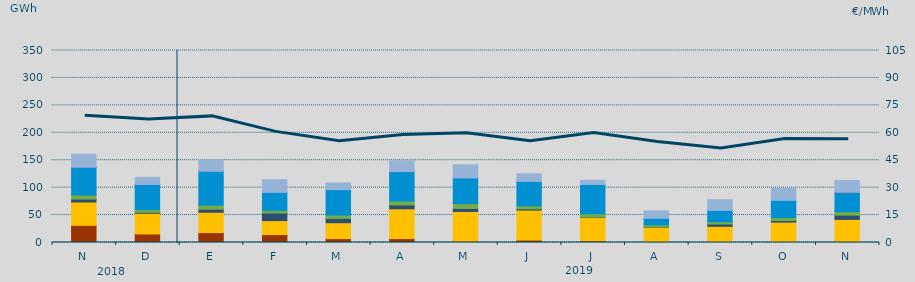
| Category | Carbón | Ciclo Combinado | Cogeneración | Consumo Bombeo | Eólica | Hidráulica | Nuclear | Otras Renovables | Solar fotovoltaica | Turbinación bombeo |
|---|---|---|---|---|---|---|---|---|---|---|
| N | 31318.1 | 42466.7 | 0 | 5322 | 7477 | 50882.1 | 34.4 | 69.8 | 0 | 23397.6 |
| D | 15554.9 | 37706.5 | 0 | 1783.4 | 5010 | 45893.5 | 75.9 | 3.2 | 0 | 12660 |
| E | 18038.9 | 37091.8 | 0 | 5584.1 | 7459.5 | 61806.6 | 125.1 | 3.8 | 0 | 20506.3 |
| F | 14436.3 | 25499.5 | 0 | 13820.1 | 4854.6 | 33013.5 | 0 | 95.8 | 0 | 22781.5 |
| M | 7069 | 28989.6 | 0 | 7976 | 6086 | 46385.5 | 0 | 4 | 0 | 12004.9 |
| A | 7133.3 | 54294.6 | 0 | 6877.3 | 7238.7 | 53741.4 | 18.8 | 1.7 | 0 | 19863.3 |
| M | 2251.7 | 54358.5 | 20 | 5480.5 | 8758.9 | 47108.2 | 0 | 17.2 | 0 | 23767.4 |
| J | 4465.4 | 54530.5 | 0 | 2188.8 | 5586 | 44612.2 | 174.7 | 1.4 | 0 | 13701.1 |
| J | 3289.6 | 42570.7 | 0 | 636.6 | 5909.9 | 53272.1 | 42.5 | 0 | 0 | 7519.8 |
| A | 446.5 | 27502.9 | 0 | 624.2 | 3670.3 | 11750 | 1 | 0 | 0 | 13635.5 |
| S | 460.6 | 28967.7 | 0 | 4234.7 | 4105.5 | 21199.2 | 0 | 2.6 | 0 | 19063.6 |
| O | 1718.2 | 35506.1 | 18 | 2744.7 | 5556.7 | 31702.3 | 0 | 0.8 | 0 | 21165.2 |
| N | 1857.3 | 40203.9 | 0 | 7774.6 | 6415.7 | 35320.4 | 90 | 0 | 4.8 | 21237.9 |